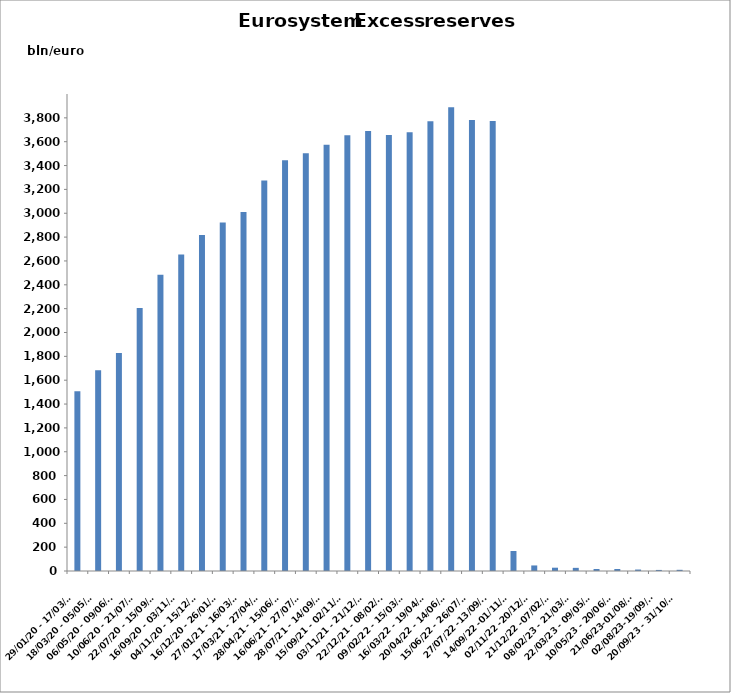
| Category | Series 0 |
|---|---|
| 29/01/20 - 17/03/20 | 1506696 |
| 18/03/20 - 05/05/20 | 1684495 |
| 06/05/20 - 09/06/20 | 1827132 |
| 10/06/20 - 21/07/20 | 2204692 |
| 22/07/20 - 15/09/20 | 2483296 |
| 16/09/20 - 03/11/20 | 2653451 |
| 04/11/20 - 15/12/20 | 2816718 |
| 16/12/20 - 26/01/21 | 2921576 |
| 27/01/21 - 16/03/21 | 3011243 |
| 17/03/21 - 27/04/21 | 3273616 |
| 28/04/21 - 15/06/21 | 3443927 |
| 16/06/21 - 27/07/21 | 3502904 |
| 28/07/21 - 14/09/21 | 3575256 |
| 15/09/21 - 02/11/21 | 3653659 |
| 03/11/21 - 21/12/21 | 3689080 |
| 22/12/21 - 08/02/22 | 3656920 |
| 09/02/22 - 15/03/22 | 3678326 |
| 16/03/22 - 19/04/22 | 3770520 |
| 20/04/22 - 14/06/22 | 3888321 |
| 15/06/22 - 26/07/22 | 3782461 |
| 27/07/22 -13/09/22 | 3774525 |
| 14/09/22 -01/11/22 | 167571 |
| 02/11/22 -20/12/22 | 46584 |
| 21/12/22 -07/02/23 | 27683 |
| 08/02/23 - 21/03/23 | 26430 |
| 22/03/23 - 09/05/23 | 16970 |
| 10/05/23 - 20/06/23 | 16812 |
| 21/06/23-01/08/23 | 12286 |
| 02/08/23-19/09/23 | 9026 |
| 20/09/23 - 31/10/23 | 10012 |